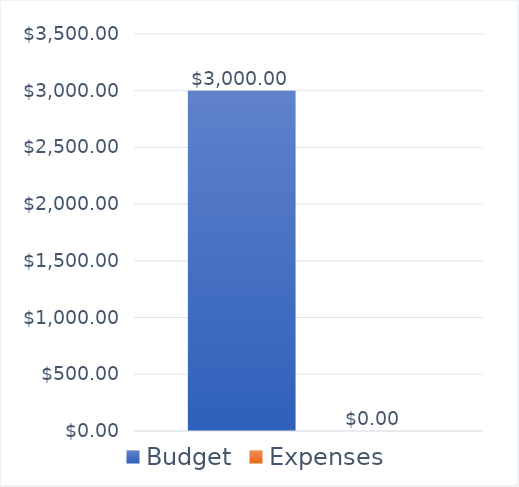
| Category | Budget | Expenses |
|---|---|---|
| 0 | 3000 | 0 |